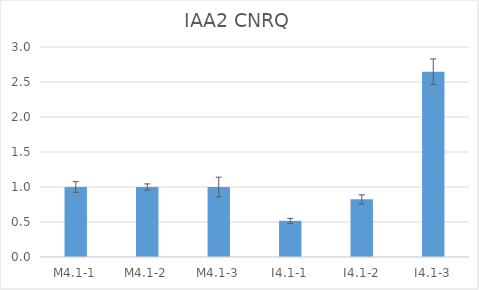
| Category | IAA2 CNRQ |
|---|---|
| M4.1-1 | 1 |
| M4.1-2 | 1 |
| M4.1-3 | 1 |
| I4.1-1 | 0.517 |
| I4.1-2 | 0.823 |
| I4.1-3 | 2.647 |